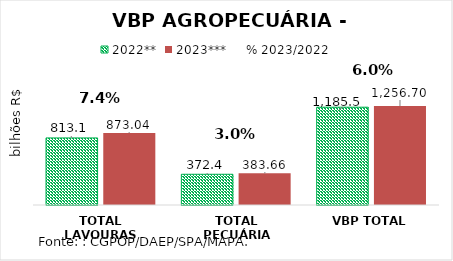
| Category | 2022** | 2023*** |
|---|---|---|
| TOTAL LAVOURAS | 813.135 | 873.041 |
| TOTAL PECUÁRIA | 372.353 | 383.656 |
| VBP TOTAL | 1185.488 | 1256.697 |